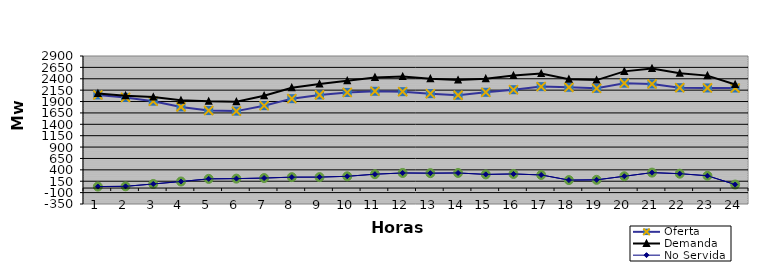
| Category | Oferta | No Servida | Demanda |
|---|---|---|---|
| 1.0 | 2045.25 | 32.652 | 2077.902 |
| 2.0 | 1990.33 | 38.187 | 2028.517 |
| 3.0 | 1907.37 | 89.675 | 1997.045 |
| 4.0 | 1782.45 | 143.513 | 1925.963 |
| 5.0 | 1702.27 | 201.93 | 1904.2 |
| 6.0 | 1689.67 | 207.298 | 1896.968 |
| 7.0 | 1809.27 | 219.855 | 2029.125 |
| 8.0 | 1963.5 | 239.622 | 2203.122 |
| 9.0 | 2045.98 | 240.595 | 2286.575 |
| 10.0 | 2099.47 | 258.218 | 2357.688 |
| 11.0 | 2125.44 | 304.546 | 2429.986 |
| 12.0 | 2116.98 | 331.104 | 2448.084 |
| 13.0 | 2073.07 | 327.246 | 2400.316 |
| 14.0 | 2039.12 | 331.43 | 2370.55 |
| 15.0 | 2102.63 | 300.079 | 2402.709 |
| 16.0 | 2160.15 | 309.873 | 2470.023 |
| 17.0 | 2227.59 | 288.093 | 2515.683 |
| 18.0 | 2212.83 | 175.201 | 2388.031 |
| 19.0 | 2190.06 | 180.64 | 2370.7 |
| 20.0 | 2302.7 | 259.569 | 2562.269 |
| 21.0 | 2285.39 | 338.766 | 2624.156 |
| 22.0 | 2204.86 | 315.862 | 2520.722 |
| 23.0 | 2198.92 | 270.052 | 2468.972 |
| 24.0 | 2196.72 | 77.25 | 2273.97 |